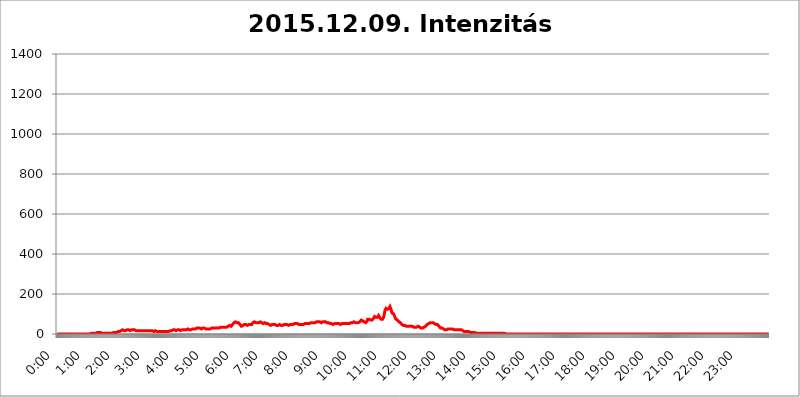
| Category | 2015.12.09. Intenzitás [W/m^2] |
|---|---|
| 0.0 | 0 |
| 0.0006944444444444445 | 0 |
| 0.001388888888888889 | 0 |
| 0.0020833333333333333 | 0 |
| 0.002777777777777778 | 0 |
| 0.003472222222222222 | 0 |
| 0.004166666666666667 | 0 |
| 0.004861111111111111 | 0 |
| 0.005555555555555556 | 0 |
| 0.0062499999999999995 | 0 |
| 0.006944444444444444 | 0 |
| 0.007638888888888889 | 0 |
| 0.008333333333333333 | 0 |
| 0.009027777777777779 | 0 |
| 0.009722222222222222 | 0 |
| 0.010416666666666666 | 0 |
| 0.011111111111111112 | 0 |
| 0.011805555555555555 | 0 |
| 0.012499999999999999 | 0 |
| 0.013194444444444444 | 0 |
| 0.013888888888888888 | 0 |
| 0.014583333333333332 | 0 |
| 0.015277777777777777 | 0 |
| 0.015972222222222224 | 0 |
| 0.016666666666666666 | 0 |
| 0.017361111111111112 | 0 |
| 0.018055555555555557 | 0 |
| 0.01875 | 0 |
| 0.019444444444444445 | 0 |
| 0.02013888888888889 | 0 |
| 0.020833333333333332 | 0 |
| 0.02152777777777778 | 0 |
| 0.022222222222222223 | 0 |
| 0.02291666666666667 | 0 |
| 0.02361111111111111 | 0 |
| 0.024305555555555556 | 0 |
| 0.024999999999999998 | 0 |
| 0.025694444444444447 | 0 |
| 0.02638888888888889 | 0 |
| 0.027083333333333334 | 0 |
| 0.027777777777777776 | 0 |
| 0.02847222222222222 | 0 |
| 0.029166666666666664 | 0 |
| 0.029861111111111113 | 0 |
| 0.030555555555555555 | 0 |
| 0.03125 | 0 |
| 0.03194444444444445 | 0 |
| 0.03263888888888889 | 0 |
| 0.03333333333333333 | 0 |
| 0.034027777777777775 | 0 |
| 0.034722222222222224 | 0 |
| 0.035416666666666666 | 0 |
| 0.036111111111111115 | 0 |
| 0.03680555555555556 | 0 |
| 0.0375 | 0 |
| 0.03819444444444444 | 0 |
| 0.03888888888888889 | 0 |
| 0.03958333333333333 | 0 |
| 0.04027777777777778 | 0 |
| 0.04097222222222222 | 0 |
| 0.041666666666666664 | 0 |
| 0.042361111111111106 | 0 |
| 0.04305555555555556 | 0 |
| 0.043750000000000004 | 0 |
| 0.044444444444444446 | 0 |
| 0.04513888888888889 | 0 |
| 0.04583333333333334 | 0 |
| 0.04652777777777778 | 0 |
| 0.04722222222222222 | 3.525 |
| 0.04791666666666666 | 3.525 |
| 0.04861111111111111 | 3.525 |
| 0.049305555555555554 | 3.525 |
| 0.049999999999999996 | 3.525 |
| 0.05069444444444445 | 3.525 |
| 0.051388888888888894 | 3.525 |
| 0.052083333333333336 | 3.525 |
| 0.05277777777777778 | 3.525 |
| 0.05347222222222222 | 3.525 |
| 0.05416666666666667 | 3.525 |
| 0.05486111111111111 | 7.887 |
| 0.05555555555555555 | 7.887 |
| 0.05625 | 7.887 |
| 0.05694444444444444 | 7.887 |
| 0.057638888888888885 | 7.887 |
| 0.05833333333333333 | 7.887 |
| 0.05902777777777778 | 7.887 |
| 0.059722222222222225 | 7.887 |
| 0.06041666666666667 | 7.887 |
| 0.061111111111111116 | 7.887 |
| 0.06180555555555556 | 3.525 |
| 0.0625 | 3.525 |
| 0.06319444444444444 | 3.525 |
| 0.06388888888888888 | 3.525 |
| 0.06458333333333334 | 3.525 |
| 0.06527777777777778 | 3.525 |
| 0.06597222222222222 | 3.525 |
| 0.06666666666666667 | 3.525 |
| 0.06736111111111111 | 3.525 |
| 0.06805555555555555 | 3.525 |
| 0.06874999999999999 | 3.525 |
| 0.06944444444444443 | 3.525 |
| 0.07013888888888889 | 3.525 |
| 0.07083333333333333 | 3.525 |
| 0.07152777777777779 | 3.525 |
| 0.07222222222222223 | 3.525 |
| 0.07291666666666667 | 3.525 |
| 0.07361111111111111 | 3.525 |
| 0.07430555555555556 | 3.525 |
| 0.075 | 3.525 |
| 0.07569444444444444 | 3.525 |
| 0.0763888888888889 | 3.525 |
| 0.07708333333333334 | 3.525 |
| 0.07777777777777778 | 3.525 |
| 0.07847222222222222 | 3.525 |
| 0.07916666666666666 | 7.887 |
| 0.0798611111111111 | 7.887 |
| 0.08055555555555556 | 7.887 |
| 0.08125 | 7.887 |
| 0.08194444444444444 | 7.887 |
| 0.08263888888888889 | 7.887 |
| 0.08333333333333333 | 7.887 |
| 0.08402777777777777 | 7.887 |
| 0.08472222222222221 | 12.257 |
| 0.08541666666666665 | 12.257 |
| 0.08611111111111112 | 12.257 |
| 0.08680555555555557 | 12.257 |
| 0.08750000000000001 | 12.257 |
| 0.08819444444444445 | 16.636 |
| 0.08888888888888889 | 16.636 |
| 0.08958333333333333 | 16.636 |
| 0.09027777777777778 | 21.024 |
| 0.09097222222222222 | 21.024 |
| 0.09166666666666667 | 21.024 |
| 0.09236111111111112 | 21.024 |
| 0.09305555555555556 | 16.636 |
| 0.09375 | 16.636 |
| 0.09444444444444444 | 16.636 |
| 0.09513888888888888 | 16.636 |
| 0.09583333333333333 | 16.636 |
| 0.09652777777777777 | 16.636 |
| 0.09722222222222222 | 21.024 |
| 0.09791666666666667 | 21.024 |
| 0.09861111111111111 | 21.024 |
| 0.09930555555555555 | 21.024 |
| 0.09999999999999999 | 21.024 |
| 0.10069444444444443 | 21.024 |
| 0.1013888888888889 | 16.636 |
| 0.10208333333333335 | 16.636 |
| 0.10277777777777779 | 21.024 |
| 0.10347222222222223 | 21.024 |
| 0.10416666666666667 | 21.024 |
| 0.10486111111111111 | 21.024 |
| 0.10555555555555556 | 21.024 |
| 0.10625 | 21.024 |
| 0.10694444444444444 | 21.024 |
| 0.1076388888888889 | 21.024 |
| 0.10833333333333334 | 21.024 |
| 0.10902777777777778 | 21.024 |
| 0.10972222222222222 | 16.636 |
| 0.1111111111111111 | 16.636 |
| 0.11180555555555556 | 16.636 |
| 0.11180555555555556 | 16.636 |
| 0.1125 | 16.636 |
| 0.11319444444444444 | 16.636 |
| 0.11388888888888889 | 16.636 |
| 0.11458333333333333 | 16.636 |
| 0.11527777777777777 | 16.636 |
| 0.11597222222222221 | 16.636 |
| 0.11666666666666665 | 16.636 |
| 0.1173611111111111 | 16.636 |
| 0.11805555555555557 | 16.636 |
| 0.11944444444444445 | 16.636 |
| 0.12013888888888889 | 16.636 |
| 0.12083333333333333 | 16.636 |
| 0.12152777777777778 | 16.636 |
| 0.12222222222222223 | 12.257 |
| 0.12291666666666667 | 16.636 |
| 0.12291666666666667 | 16.636 |
| 0.12361111111111112 | 16.636 |
| 0.12430555555555556 | 16.636 |
| 0.125 | 16.636 |
| 0.12569444444444444 | 16.636 |
| 0.12638888888888888 | 16.636 |
| 0.12708333333333333 | 16.636 |
| 0.16875 | 16.636 |
| 0.12847222222222224 | 16.636 |
| 0.12916666666666668 | 16.636 |
| 0.12986111111111112 | 16.636 |
| 0.13055555555555556 | 16.636 |
| 0.13125 | 16.636 |
| 0.13194444444444445 | 12.257 |
| 0.1326388888888889 | 12.257 |
| 0.13333333333333333 | 16.636 |
| 0.13402777777777777 | 12.257 |
| 0.13402777777777777 | 12.257 |
| 0.13472222222222222 | 12.257 |
| 0.13541666666666666 | 16.636 |
| 0.1361111111111111 | 16.636 |
| 0.13749999999999998 | 16.636 |
| 0.13819444444444443 | 16.636 |
| 0.1388888888888889 | 16.636 |
| 0.13958333333333334 | 12.257 |
| 0.14027777777777778 | 12.257 |
| 0.14097222222222222 | 12.257 |
| 0.14166666666666666 | 12.257 |
| 0.1423611111111111 | 12.257 |
| 0.14305555555555557 | 12.257 |
| 0.14375000000000002 | 12.257 |
| 0.14444444444444446 | 12.257 |
| 0.1451388888888889 | 12.257 |
| 0.1451388888888889 | 12.257 |
| 0.14652777777777778 | 12.257 |
| 0.14722222222222223 | 12.257 |
| 0.14791666666666667 | 12.257 |
| 0.1486111111111111 | 12.257 |
| 0.14930555555555555 | 12.257 |
| 0.15 | 12.257 |
| 0.15069444444444444 | 12.257 |
| 0.15138888888888888 | 12.257 |
| 0.15208333333333332 | 12.257 |
| 0.15277777777777776 | 12.257 |
| 0.15347222222222223 | 12.257 |
| 0.15416666666666667 | 12.257 |
| 0.15486111111111112 | 12.257 |
| 0.15555555555555556 | 12.257 |
| 0.15625 | 12.257 |
| 0.15694444444444444 | 12.257 |
| 0.15763888888888888 | 16.636 |
| 0.15833333333333333 | 16.636 |
| 0.15902777777777777 | 16.636 |
| 0.15972222222222224 | 16.636 |
| 0.16041666666666668 | 16.636 |
| 0.16111111111111112 | 16.636 |
| 0.16180555555555556 | 21.024 |
| 0.1625 | 21.024 |
| 0.16319444444444445 | 16.636 |
| 0.1638888888888889 | 21.024 |
| 0.16458333333333333 | 21.024 |
| 0.16527777777777777 | 21.024 |
| 0.16597222222222222 | 21.024 |
| 0.16666666666666666 | 16.636 |
| 0.1673611111111111 | 16.636 |
| 0.16805555555555554 | 16.636 |
| 0.16874999999999998 | 21.024 |
| 0.16944444444444443 | 21.024 |
| 0.17013888888888887 | 21.024 |
| 0.1708333333333333 | 21.024 |
| 0.17152777777777775 | 16.636 |
| 0.17222222222222225 | 16.636 |
| 0.1729166666666667 | 16.636 |
| 0.17361111111111113 | 16.636 |
| 0.17430555555555557 | 16.636 |
| 0.17500000000000002 | 21.024 |
| 0.17569444444444446 | 21.024 |
| 0.1763888888888889 | 21.024 |
| 0.17708333333333334 | 21.024 |
| 0.17777777777777778 | 21.024 |
| 0.17847222222222223 | 21.024 |
| 0.17916666666666667 | 21.024 |
| 0.1798611111111111 | 21.024 |
| 0.18055555555555555 | 21.024 |
| 0.18125 | 21.024 |
| 0.18194444444444444 | 21.024 |
| 0.1826388888888889 | 25.419 |
| 0.18333333333333335 | 25.419 |
| 0.1840277777777778 | 25.419 |
| 0.18472222222222223 | 25.419 |
| 0.18541666666666667 | 21.024 |
| 0.18611111111111112 | 21.024 |
| 0.18680555555555556 | 21.024 |
| 0.1875 | 21.024 |
| 0.18819444444444444 | 21.024 |
| 0.18888888888888888 | 21.024 |
| 0.18958333333333333 | 25.419 |
| 0.19027777777777777 | 25.419 |
| 0.1909722222222222 | 25.419 |
| 0.19166666666666665 | 25.419 |
| 0.19236111111111112 | 25.419 |
| 0.19305555555555554 | 25.419 |
| 0.19375 | 25.419 |
| 0.19444444444444445 | 25.419 |
| 0.1951388888888889 | 25.419 |
| 0.19583333333333333 | 29.823 |
| 0.19652777777777777 | 29.823 |
| 0.19722222222222222 | 29.823 |
| 0.19791666666666666 | 29.823 |
| 0.1986111111111111 | 29.823 |
| 0.19930555555555554 | 29.823 |
| 0.19999999999999998 | 29.823 |
| 0.20069444444444443 | 25.419 |
| 0.20138888888888887 | 25.419 |
| 0.2020833333333333 | 25.419 |
| 0.2027777777777778 | 25.419 |
| 0.2034722222222222 | 25.419 |
| 0.2041666666666667 | 29.823 |
| 0.20486111111111113 | 29.823 |
| 0.20555555555555557 | 29.823 |
| 0.20625000000000002 | 29.823 |
| 0.20694444444444446 | 25.419 |
| 0.2076388888888889 | 25.419 |
| 0.20833333333333334 | 25.419 |
| 0.20902777777777778 | 25.419 |
| 0.20972222222222223 | 25.419 |
| 0.21041666666666667 | 25.419 |
| 0.2111111111111111 | 25.419 |
| 0.21180555555555555 | 25.419 |
| 0.2125 | 25.419 |
| 0.21319444444444444 | 25.419 |
| 0.2138888888888889 | 25.419 |
| 0.21458333333333335 | 25.419 |
| 0.2152777777777778 | 25.419 |
| 0.21597222222222223 | 29.823 |
| 0.21666666666666667 | 29.823 |
| 0.21736111111111112 | 29.823 |
| 0.21805555555555556 | 29.823 |
| 0.21875 | 29.823 |
| 0.21944444444444444 | 29.823 |
| 0.22013888888888888 | 29.823 |
| 0.22083333333333333 | 29.823 |
| 0.22152777777777777 | 29.823 |
| 0.2222222222222222 | 29.823 |
| 0.22291666666666665 | 29.823 |
| 0.2236111111111111 | 29.823 |
| 0.22430555555555556 | 29.823 |
| 0.225 | 29.823 |
| 0.22569444444444445 | 29.823 |
| 0.2263888888888889 | 29.823 |
| 0.22708333333333333 | 29.823 |
| 0.22777777777777777 | 29.823 |
| 0.22847222222222222 | 29.823 |
| 0.22916666666666666 | 34.234 |
| 0.2298611111111111 | 34.234 |
| 0.23055555555555554 | 34.234 |
| 0.23124999999999998 | 34.234 |
| 0.23194444444444443 | 34.234 |
| 0.23263888888888887 | 34.234 |
| 0.2333333333333333 | 34.234 |
| 0.2340277777777778 | 34.234 |
| 0.2347222222222222 | 34.234 |
| 0.2354166666666667 | 34.234 |
| 0.23611111111111113 | 34.234 |
| 0.23680555555555557 | 34.234 |
| 0.23750000000000002 | 34.234 |
| 0.23819444444444446 | 38.653 |
| 0.2388888888888889 | 38.653 |
| 0.23958333333333334 | 38.653 |
| 0.24027777777777778 | 38.653 |
| 0.24097222222222223 | 38.653 |
| 0.24166666666666667 | 43.079 |
| 0.2423611111111111 | 43.079 |
| 0.24305555555555555 | 43.079 |
| 0.24375 | 38.653 |
| 0.24444444444444446 | 38.653 |
| 0.24513888888888888 | 43.079 |
| 0.24583333333333335 | 47.511 |
| 0.2465277777777778 | 47.511 |
| 0.24722222222222223 | 51.951 |
| 0.24791666666666667 | 56.398 |
| 0.24861111111111112 | 56.398 |
| 0.24930555555555556 | 56.398 |
| 0.25 | 60.85 |
| 0.25069444444444444 | 60.85 |
| 0.2513888888888889 | 56.398 |
| 0.2520833333333333 | 56.398 |
| 0.25277777777777777 | 56.398 |
| 0.2534722222222222 | 56.398 |
| 0.25416666666666665 | 56.398 |
| 0.2548611111111111 | 51.951 |
| 0.2555555555555556 | 51.951 |
| 0.25625000000000003 | 47.511 |
| 0.2569444444444445 | 43.079 |
| 0.2576388888888889 | 43.079 |
| 0.25833333333333336 | 38.653 |
| 0.2590277777777778 | 38.653 |
| 0.25972222222222224 | 38.653 |
| 0.2604166666666667 | 43.079 |
| 0.2611111111111111 | 43.079 |
| 0.26180555555555557 | 43.079 |
| 0.2625 | 47.511 |
| 0.26319444444444445 | 47.511 |
| 0.2638888888888889 | 47.511 |
| 0.26458333333333334 | 47.511 |
| 0.2652777777777778 | 47.511 |
| 0.2659722222222222 | 47.511 |
| 0.26666666666666666 | 43.079 |
| 0.2673611111111111 | 43.079 |
| 0.26805555555555555 | 43.079 |
| 0.26875 | 47.511 |
| 0.26944444444444443 | 47.511 |
| 0.2701388888888889 | 47.511 |
| 0.2708333333333333 | 47.511 |
| 0.27152777777777776 | 47.511 |
| 0.2722222222222222 | 47.511 |
| 0.27291666666666664 | 47.511 |
| 0.2736111111111111 | 51.951 |
| 0.2743055555555555 | 56.398 |
| 0.27499999999999997 | 60.85 |
| 0.27569444444444446 | 60.85 |
| 0.27638888888888885 | 60.85 |
| 0.27708333333333335 | 60.85 |
| 0.2777777777777778 | 60.85 |
| 0.27847222222222223 | 56.398 |
| 0.2791666666666667 | 56.398 |
| 0.2798611111111111 | 56.398 |
| 0.28055555555555556 | 56.398 |
| 0.28125 | 56.398 |
| 0.28194444444444444 | 56.398 |
| 0.2826388888888889 | 56.398 |
| 0.2833333333333333 | 60.85 |
| 0.28402777777777777 | 60.85 |
| 0.2847222222222222 | 60.85 |
| 0.28541666666666665 | 60.85 |
| 0.28611111111111115 | 56.398 |
| 0.28680555555555554 | 56.398 |
| 0.28750000000000003 | 56.398 |
| 0.2881944444444445 | 51.951 |
| 0.2888888888888889 | 51.951 |
| 0.28958333333333336 | 51.951 |
| 0.2902777777777778 | 56.398 |
| 0.29097222222222224 | 56.398 |
| 0.2916666666666667 | 56.398 |
| 0.2923611111111111 | 56.398 |
| 0.29305555555555557 | 51.951 |
| 0.29375 | 51.951 |
| 0.29444444444444445 | 51.951 |
| 0.2951388888888889 | 51.951 |
| 0.29583333333333334 | 51.951 |
| 0.2965277777777778 | 47.511 |
| 0.2972222222222222 | 47.511 |
| 0.29791666666666666 | 47.511 |
| 0.2986111111111111 | 47.511 |
| 0.29930555555555555 | 43.079 |
| 0.3 | 47.511 |
| 0.30069444444444443 | 47.511 |
| 0.3013888888888889 | 47.511 |
| 0.3020833333333333 | 47.511 |
| 0.30277777777777776 | 51.951 |
| 0.3034722222222222 | 47.511 |
| 0.30416666666666664 | 47.511 |
| 0.3048611111111111 | 47.511 |
| 0.3055555555555555 | 47.511 |
| 0.30624999999999997 | 43.079 |
| 0.3069444444444444 | 43.079 |
| 0.3076388888888889 | 43.079 |
| 0.30833333333333335 | 43.079 |
| 0.3090277777777778 | 43.079 |
| 0.30972222222222223 | 43.079 |
| 0.3104166666666667 | 47.511 |
| 0.3111111111111111 | 47.511 |
| 0.31180555555555556 | 47.511 |
| 0.3125 | 43.079 |
| 0.31319444444444444 | 43.079 |
| 0.3138888888888889 | 43.079 |
| 0.3145833333333333 | 43.079 |
| 0.31527777777777777 | 43.079 |
| 0.3159722222222222 | 43.079 |
| 0.31666666666666665 | 43.079 |
| 0.31736111111111115 | 47.511 |
| 0.31805555555555554 | 47.511 |
| 0.31875000000000003 | 47.511 |
| 0.3194444444444445 | 47.511 |
| 0.3201388888888889 | 47.511 |
| 0.32083333333333336 | 47.511 |
| 0.3215277777777778 | 47.511 |
| 0.32222222222222224 | 47.511 |
| 0.3229166666666667 | 43.079 |
| 0.3236111111111111 | 43.079 |
| 0.32430555555555557 | 43.079 |
| 0.325 | 47.511 |
| 0.32569444444444445 | 47.511 |
| 0.3263888888888889 | 47.511 |
| 0.32708333333333334 | 47.511 |
| 0.3277777777777778 | 47.511 |
| 0.3284722222222222 | 47.511 |
| 0.32916666666666666 | 47.511 |
| 0.3298611111111111 | 47.511 |
| 0.33055555555555555 | 47.511 |
| 0.33125 | 47.511 |
| 0.33194444444444443 | 47.511 |
| 0.3326388888888889 | 51.951 |
| 0.3333333333333333 | 51.951 |
| 0.3340277777777778 | 51.951 |
| 0.3347222222222222 | 51.951 |
| 0.3354166666666667 | 51.951 |
| 0.3361111111111111 | 51.951 |
| 0.3368055555555556 | 51.951 |
| 0.33749999999999997 | 51.951 |
| 0.33819444444444446 | 47.511 |
| 0.33888888888888885 | 47.511 |
| 0.33958333333333335 | 47.511 |
| 0.34027777777777773 | 47.511 |
| 0.34097222222222223 | 47.511 |
| 0.3416666666666666 | 47.511 |
| 0.3423611111111111 | 47.511 |
| 0.3430555555555555 | 47.511 |
| 0.34375 | 47.511 |
| 0.3444444444444445 | 47.511 |
| 0.3451388888888889 | 47.511 |
| 0.3458333333333334 | 51.951 |
| 0.34652777777777777 | 51.951 |
| 0.34722222222222227 | 51.951 |
| 0.34791666666666665 | 51.951 |
| 0.34861111111111115 | 51.951 |
| 0.34930555555555554 | 51.951 |
| 0.35000000000000003 | 51.951 |
| 0.3506944444444444 | 51.951 |
| 0.3513888888888889 | 51.951 |
| 0.3520833333333333 | 51.951 |
| 0.3527777777777778 | 51.951 |
| 0.3534722222222222 | 51.951 |
| 0.3541666666666667 | 56.398 |
| 0.3548611111111111 | 56.398 |
| 0.35555555555555557 | 56.398 |
| 0.35625 | 56.398 |
| 0.35694444444444445 | 56.398 |
| 0.3576388888888889 | 56.398 |
| 0.35833333333333334 | 56.398 |
| 0.3590277777777778 | 56.398 |
| 0.3597222222222222 | 56.398 |
| 0.36041666666666666 | 56.398 |
| 0.3611111111111111 | 56.398 |
| 0.36180555555555555 | 56.398 |
| 0.3625 | 60.85 |
| 0.36319444444444443 | 60.85 |
| 0.3638888888888889 | 60.85 |
| 0.3645833333333333 | 60.85 |
| 0.3652777777777778 | 60.85 |
| 0.3659722222222222 | 60.85 |
| 0.3666666666666667 | 60.85 |
| 0.3673611111111111 | 65.31 |
| 0.3680555555555556 | 60.85 |
| 0.36874999999999997 | 56.398 |
| 0.36944444444444446 | 56.398 |
| 0.37013888888888885 | 56.398 |
| 0.37083333333333335 | 56.398 |
| 0.37152777777777773 | 56.398 |
| 0.37222222222222223 | 60.85 |
| 0.3729166666666666 | 60.85 |
| 0.3736111111111111 | 60.85 |
| 0.3743055555555555 | 60.85 |
| 0.375 | 60.85 |
| 0.3756944444444445 | 60.85 |
| 0.3763888888888889 | 60.85 |
| 0.3770833333333334 | 60.85 |
| 0.37777777777777777 | 60.85 |
| 0.37847222222222227 | 56.398 |
| 0.37916666666666665 | 56.398 |
| 0.37986111111111115 | 56.398 |
| 0.38055555555555554 | 56.398 |
| 0.38125000000000003 | 56.398 |
| 0.3819444444444444 | 51.951 |
| 0.3826388888888889 | 51.951 |
| 0.3833333333333333 | 51.951 |
| 0.3840277777777778 | 51.951 |
| 0.3847222222222222 | 51.951 |
| 0.3854166666666667 | 51.951 |
| 0.3861111111111111 | 51.951 |
| 0.38680555555555557 | 47.511 |
| 0.3875 | 47.511 |
| 0.38819444444444445 | 51.951 |
| 0.3888888888888889 | 51.951 |
| 0.38958333333333334 | 51.951 |
| 0.3902777777777778 | 47.511 |
| 0.3909722222222222 | 51.951 |
| 0.39166666666666666 | 51.951 |
| 0.3923611111111111 | 47.511 |
| 0.39305555555555555 | 51.951 |
| 0.39375 | 47.511 |
| 0.39444444444444443 | 51.951 |
| 0.3951388888888889 | 51.951 |
| 0.3958333333333333 | 51.951 |
| 0.3965277777777778 | 51.951 |
| 0.3972222222222222 | 47.511 |
| 0.3979166666666667 | 51.951 |
| 0.3986111111111111 | 51.951 |
| 0.3993055555555556 | 51.951 |
| 0.39999999999999997 | 51.951 |
| 0.40069444444444446 | 51.951 |
| 0.40138888888888885 | 51.951 |
| 0.40208333333333335 | 51.951 |
| 0.40277777777777773 | 51.951 |
| 0.40347222222222223 | 51.951 |
| 0.4041666666666666 | 51.951 |
| 0.4048611111111111 | 51.951 |
| 0.4055555555555555 | 51.951 |
| 0.40625 | 51.951 |
| 0.4069444444444445 | 51.951 |
| 0.4076388888888889 | 51.951 |
| 0.4083333333333334 | 51.951 |
| 0.40902777777777777 | 51.951 |
| 0.40972222222222227 | 51.951 |
| 0.41041666666666665 | 51.951 |
| 0.41111111111111115 | 51.951 |
| 0.41180555555555554 | 56.398 |
| 0.41250000000000003 | 56.398 |
| 0.4131944444444444 | 56.398 |
| 0.4138888888888889 | 56.398 |
| 0.4145833333333333 | 60.85 |
| 0.4152777777777778 | 60.85 |
| 0.4159722222222222 | 60.85 |
| 0.4166666666666667 | 60.85 |
| 0.4173611111111111 | 60.85 |
| 0.41805555555555557 | 56.398 |
| 0.41875 | 56.398 |
| 0.41944444444444445 | 56.398 |
| 0.4201388888888889 | 56.398 |
| 0.42083333333333334 | 56.398 |
| 0.4215277777777778 | 56.398 |
| 0.4222222222222222 | 56.398 |
| 0.42291666666666666 | 60.85 |
| 0.4236111111111111 | 60.85 |
| 0.42430555555555555 | 60.85 |
| 0.425 | 60.85 |
| 0.42569444444444443 | 65.31 |
| 0.4263888888888889 | 69.775 |
| 0.4270833333333333 | 69.775 |
| 0.4277777777777778 | 69.775 |
| 0.4284722222222222 | 65.31 |
| 0.4291666666666667 | 65.31 |
| 0.4298611111111111 | 60.85 |
| 0.4305555555555556 | 60.85 |
| 0.43124999999999997 | 56.398 |
| 0.43194444444444446 | 56.398 |
| 0.43263888888888885 | 56.398 |
| 0.43333333333333335 | 56.398 |
| 0.43402777777777773 | 60.85 |
| 0.43472222222222223 | 65.31 |
| 0.4354166666666666 | 74.246 |
| 0.4361111111111111 | 78.722 |
| 0.4368055555555555 | 78.722 |
| 0.4375 | 74.246 |
| 0.4381944444444445 | 74.246 |
| 0.4388888888888889 | 74.246 |
| 0.4395833333333334 | 69.775 |
| 0.44027777777777777 | 69.775 |
| 0.44097222222222227 | 69.775 |
| 0.44166666666666665 | 69.775 |
| 0.44236111111111115 | 74.246 |
| 0.44305555555555554 | 74.246 |
| 0.44375000000000003 | 78.722 |
| 0.4444444444444444 | 83.205 |
| 0.4451388888888889 | 87.692 |
| 0.4458333333333333 | 92.184 |
| 0.4465277777777778 | 92.184 |
| 0.4472222222222222 | 83.205 |
| 0.4479166666666667 | 83.205 |
| 0.4486111111111111 | 83.205 |
| 0.44930555555555557 | 83.205 |
| 0.45 | 87.692 |
| 0.45069444444444445 | 92.184 |
| 0.4513888888888889 | 87.692 |
| 0.45208333333333334 | 83.205 |
| 0.4527777777777778 | 78.722 |
| 0.4534722222222222 | 78.722 |
| 0.45416666666666666 | 74.246 |
| 0.4548611111111111 | 69.775 |
| 0.45555555555555555 | 69.775 |
| 0.45625 | 74.246 |
| 0.45694444444444443 | 78.722 |
| 0.4576388888888889 | 83.205 |
| 0.4583333333333333 | 92.184 |
| 0.4590277777777778 | 105.69 |
| 0.4597222222222222 | 119.235 |
| 0.4604166666666667 | 123.758 |
| 0.4611111111111111 | 128.284 |
| 0.4618055555555556 | 132.814 |
| 0.46249999999999997 | 128.284 |
| 0.46319444444444446 | 123.758 |
| 0.46388888888888885 | 119.235 |
| 0.46458333333333335 | 123.758 |
| 0.46527777777777773 | 128.284 |
| 0.46597222222222223 | 132.814 |
| 0.4666666666666666 | 137.347 |
| 0.4673611111111111 | 132.814 |
| 0.4680555555555555 | 123.758 |
| 0.46875 | 114.716 |
| 0.4694444444444445 | 105.69 |
| 0.4701388888888889 | 105.69 |
| 0.4708333333333334 | 101.184 |
| 0.47152777777777777 | 101.184 |
| 0.47222222222222227 | 101.184 |
| 0.47291666666666665 | 92.184 |
| 0.47361111111111115 | 83.205 |
| 0.47430555555555554 | 78.722 |
| 0.47500000000000003 | 74.246 |
| 0.4756944444444444 | 74.246 |
| 0.4763888888888889 | 69.775 |
| 0.4770833333333333 | 69.775 |
| 0.4777777777777778 | 65.31 |
| 0.4784722222222222 | 65.31 |
| 0.4791666666666667 | 60.85 |
| 0.4798611111111111 | 56.398 |
| 0.48055555555555557 | 56.398 |
| 0.48125 | 56.398 |
| 0.48194444444444445 | 51.951 |
| 0.4826388888888889 | 51.951 |
| 0.48333333333333334 | 47.511 |
| 0.4840277777777778 | 47.511 |
| 0.4847222222222222 | 47.511 |
| 0.48541666666666666 | 43.079 |
| 0.4861111111111111 | 43.079 |
| 0.48680555555555555 | 43.079 |
| 0.4875 | 43.079 |
| 0.48819444444444443 | 38.653 |
| 0.4888888888888889 | 38.653 |
| 0.4895833333333333 | 38.653 |
| 0.4902777777777778 | 38.653 |
| 0.4909722222222222 | 38.653 |
| 0.4916666666666667 | 38.653 |
| 0.4923611111111111 | 38.653 |
| 0.4930555555555556 | 38.653 |
| 0.49374999999999997 | 38.653 |
| 0.49444444444444446 | 38.653 |
| 0.49513888888888885 | 38.653 |
| 0.49583333333333335 | 38.653 |
| 0.49652777777777773 | 34.234 |
| 0.49722222222222223 | 38.653 |
| 0.4979166666666666 | 38.653 |
| 0.4986111111111111 | 34.234 |
| 0.4993055555555555 | 34.234 |
| 0.5 | 34.234 |
| 0.5006944444444444 | 34.234 |
| 0.5013888888888889 | 34.234 |
| 0.5020833333333333 | 34.234 |
| 0.5027777777777778 | 34.234 |
| 0.5034722222222222 | 34.234 |
| 0.5041666666666667 | 34.234 |
| 0.5048611111111111 | 38.653 |
| 0.5055555555555555 | 38.653 |
| 0.50625 | 38.653 |
| 0.5069444444444444 | 38.653 |
| 0.5076388888888889 | 34.234 |
| 0.5083333333333333 | 34.234 |
| 0.5090277777777777 | 34.234 |
| 0.5097222222222222 | 34.234 |
| 0.5104166666666666 | 29.823 |
| 0.5111111111111112 | 29.823 |
| 0.5118055555555555 | 29.823 |
| 0.5125000000000001 | 29.823 |
| 0.5131944444444444 | 34.234 |
| 0.513888888888889 | 34.234 |
| 0.5145833333333333 | 34.234 |
| 0.5152777777777778 | 34.234 |
| 0.5159722222222222 | 38.653 |
| 0.5166666666666667 | 38.653 |
| 0.517361111111111 | 38.653 |
| 0.5180555555555556 | 43.079 |
| 0.5187499999999999 | 47.511 |
| 0.5194444444444445 | 47.511 |
| 0.5201388888888888 | 47.511 |
| 0.5208333333333334 | 51.951 |
| 0.5215277777777778 | 51.951 |
| 0.5222222222222223 | 51.951 |
| 0.5229166666666667 | 56.398 |
| 0.5236111111111111 | 56.398 |
| 0.5243055555555556 | 56.398 |
| 0.525 | 56.398 |
| 0.5256944444444445 | 56.398 |
| 0.5263888888888889 | 56.398 |
| 0.5270833333333333 | 56.398 |
| 0.5277777777777778 | 56.398 |
| 0.5284722222222222 | 51.951 |
| 0.5291666666666667 | 51.951 |
| 0.5298611111111111 | 51.951 |
| 0.5305555555555556 | 51.951 |
| 0.53125 | 47.511 |
| 0.5319444444444444 | 47.511 |
| 0.5326388888888889 | 47.511 |
| 0.5333333333333333 | 47.511 |
| 0.5340277777777778 | 43.079 |
| 0.5347222222222222 | 43.079 |
| 0.5354166666666667 | 38.653 |
| 0.5361111111111111 | 38.653 |
| 0.5368055555555555 | 34.234 |
| 0.5375 | 29.823 |
| 0.5381944444444444 | 29.823 |
| 0.5388888888888889 | 29.823 |
| 0.5395833333333333 | 29.823 |
| 0.5402777777777777 | 29.823 |
| 0.5409722222222222 | 29.823 |
| 0.5416666666666666 | 25.419 |
| 0.5423611111111112 | 25.419 |
| 0.5430555555555555 | 25.419 |
| 0.5437500000000001 | 21.024 |
| 0.5444444444444444 | 21.024 |
| 0.545138888888889 | 25.419 |
| 0.5458333333333333 | 21.024 |
| 0.5465277777777778 | 21.024 |
| 0.5472222222222222 | 25.419 |
| 0.5479166666666667 | 25.419 |
| 0.548611111111111 | 25.419 |
| 0.5493055555555556 | 25.419 |
| 0.5499999999999999 | 25.419 |
| 0.5506944444444445 | 25.419 |
| 0.5513888888888888 | 25.419 |
| 0.5520833333333334 | 25.419 |
| 0.5527777777777778 | 21.024 |
| 0.5534722222222223 | 25.419 |
| 0.5541666666666667 | 25.419 |
| 0.5548611111111111 | 25.419 |
| 0.5555555555555556 | 21.024 |
| 0.55625 | 21.024 |
| 0.5569444444444445 | 21.024 |
| 0.5576388888888889 | 21.024 |
| 0.5583333333333333 | 21.024 |
| 0.5590277777777778 | 21.024 |
| 0.5597222222222222 | 21.024 |
| 0.5604166666666667 | 21.024 |
| 0.5611111111111111 | 21.024 |
| 0.5618055555555556 | 21.024 |
| 0.5625 | 21.024 |
| 0.5631944444444444 | 21.024 |
| 0.5638888888888889 | 21.024 |
| 0.5645833333333333 | 21.024 |
| 0.5652777777777778 | 21.024 |
| 0.5659722222222222 | 21.024 |
| 0.5666666666666667 | 21.024 |
| 0.5673611111111111 | 16.636 |
| 0.5680555555555555 | 16.636 |
| 0.56875 | 16.636 |
| 0.5694444444444444 | 16.636 |
| 0.5701388888888889 | 16.636 |
| 0.5708333333333333 | 12.257 |
| 0.5715277777777777 | 12.257 |
| 0.5722222222222222 | 12.257 |
| 0.5729166666666666 | 12.257 |
| 0.5736111111111112 | 12.257 |
| 0.5743055555555555 | 12.257 |
| 0.5750000000000001 | 12.257 |
| 0.5756944444444444 | 12.257 |
| 0.576388888888889 | 12.257 |
| 0.5770833333333333 | 12.257 |
| 0.5777777777777778 | 7.887 |
| 0.5784722222222222 | 7.887 |
| 0.5791666666666667 | 7.887 |
| 0.579861111111111 | 7.887 |
| 0.5805555555555556 | 7.887 |
| 0.5812499999999999 | 7.887 |
| 0.5819444444444445 | 7.887 |
| 0.5826388888888888 | 7.887 |
| 0.5833333333333334 | 7.887 |
| 0.5840277777777778 | 7.887 |
| 0.5847222222222223 | 7.887 |
| 0.5854166666666667 | 7.887 |
| 0.5861111111111111 | 3.525 |
| 0.5868055555555556 | 3.525 |
| 0.5875 | 3.525 |
| 0.5881944444444445 | 3.525 |
| 0.5888888888888889 | 3.525 |
| 0.5895833333333333 | 3.525 |
| 0.5902777777777778 | 3.525 |
| 0.5909722222222222 | 3.525 |
| 0.5916666666666667 | 3.525 |
| 0.5923611111111111 | 3.525 |
| 0.5930555555555556 | 3.525 |
| 0.59375 | 3.525 |
| 0.5944444444444444 | 3.525 |
| 0.5951388888888889 | 3.525 |
| 0.5958333333333333 | 3.525 |
| 0.5965277777777778 | 3.525 |
| 0.5972222222222222 | 3.525 |
| 0.5979166666666667 | 3.525 |
| 0.5986111111111111 | 3.525 |
| 0.5993055555555555 | 3.525 |
| 0.6 | 3.525 |
| 0.6006944444444444 | 3.525 |
| 0.6013888888888889 | 3.525 |
| 0.6020833333333333 | 3.525 |
| 0.6027777777777777 | 3.525 |
| 0.6034722222222222 | 3.525 |
| 0.6041666666666666 | 3.525 |
| 0.6048611111111112 | 3.525 |
| 0.6055555555555555 | 3.525 |
| 0.6062500000000001 | 3.525 |
| 0.6069444444444444 | 3.525 |
| 0.607638888888889 | 3.525 |
| 0.6083333333333333 | 3.525 |
| 0.6090277777777778 | 3.525 |
| 0.6097222222222222 | 3.525 |
| 0.6104166666666667 | 3.525 |
| 0.611111111111111 | 3.525 |
| 0.6118055555555556 | 3.525 |
| 0.6124999999999999 | 3.525 |
| 0.6131944444444445 | 3.525 |
| 0.6138888888888888 | 3.525 |
| 0.6145833333333334 | 3.525 |
| 0.6152777777777778 | 3.525 |
| 0.6159722222222223 | 3.525 |
| 0.6166666666666667 | 3.525 |
| 0.6173611111111111 | 3.525 |
| 0.6180555555555556 | 3.525 |
| 0.61875 | 3.525 |
| 0.6194444444444445 | 3.525 |
| 0.6201388888888889 | 3.525 |
| 0.6208333333333333 | 3.525 |
| 0.6215277777777778 | 3.525 |
| 0.6222222222222222 | 3.525 |
| 0.6229166666666667 | 3.525 |
| 0.6236111111111111 | 3.525 |
| 0.6243055555555556 | 3.525 |
| 0.625 | 3.525 |
| 0.6256944444444444 | 3.525 |
| 0.6263888888888889 | 3.525 |
| 0.6270833333333333 | 3.525 |
| 0.6277777777777778 | 3.525 |
| 0.6284722222222222 | 3.525 |
| 0.6291666666666667 | 0 |
| 0.6298611111111111 | 3.525 |
| 0.6305555555555555 | 0 |
| 0.63125 | 0 |
| 0.6319444444444444 | 0 |
| 0.6326388888888889 | 0 |
| 0.6333333333333333 | 0 |
| 0.6340277777777777 | 0 |
| 0.6347222222222222 | 0 |
| 0.6354166666666666 | 0 |
| 0.6361111111111112 | 0 |
| 0.6368055555555555 | 0 |
| 0.6375000000000001 | 0 |
| 0.6381944444444444 | 0 |
| 0.638888888888889 | 0 |
| 0.6395833333333333 | 0 |
| 0.6402777777777778 | 0 |
| 0.6409722222222222 | 0 |
| 0.6416666666666667 | 0 |
| 0.642361111111111 | 0 |
| 0.6430555555555556 | 0 |
| 0.6437499999999999 | 0 |
| 0.6444444444444445 | 0 |
| 0.6451388888888888 | 0 |
| 0.6458333333333334 | 0 |
| 0.6465277777777778 | 0 |
| 0.6472222222222223 | 0 |
| 0.6479166666666667 | 0 |
| 0.6486111111111111 | 0 |
| 0.6493055555555556 | 0 |
| 0.65 | 0 |
| 0.6506944444444445 | 0 |
| 0.6513888888888889 | 0 |
| 0.6520833333333333 | 0 |
| 0.6527777777777778 | 0 |
| 0.6534722222222222 | 0 |
| 0.6541666666666667 | 0 |
| 0.6548611111111111 | 0 |
| 0.6555555555555556 | 0 |
| 0.65625 | 0 |
| 0.6569444444444444 | 0 |
| 0.6576388888888889 | 0 |
| 0.6583333333333333 | 0 |
| 0.6590277777777778 | 0 |
| 0.6597222222222222 | 0 |
| 0.6604166666666667 | 0 |
| 0.6611111111111111 | 0 |
| 0.6618055555555555 | 0 |
| 0.6625 | 0 |
| 0.6631944444444444 | 0 |
| 0.6638888888888889 | 0 |
| 0.6645833333333333 | 0 |
| 0.6652777777777777 | 0 |
| 0.6659722222222222 | 0 |
| 0.6666666666666666 | 0 |
| 0.6673611111111111 | 0 |
| 0.6680555555555556 | 0 |
| 0.6687500000000001 | 0 |
| 0.6694444444444444 | 0 |
| 0.6701388888888888 | 0 |
| 0.6708333333333334 | 0 |
| 0.6715277777777778 | 0 |
| 0.6722222222222222 | 0 |
| 0.6729166666666666 | 0 |
| 0.6736111111111112 | 0 |
| 0.6743055555555556 | 0 |
| 0.6749999999999999 | 0 |
| 0.6756944444444444 | 0 |
| 0.6763888888888889 | 0 |
| 0.6770833333333334 | 0 |
| 0.6777777777777777 | 0 |
| 0.6784722222222223 | 0 |
| 0.6791666666666667 | 0 |
| 0.6798611111111111 | 0 |
| 0.6805555555555555 | 0 |
| 0.68125 | 0 |
| 0.6819444444444445 | 0 |
| 0.6826388888888889 | 0 |
| 0.6833333333333332 | 0 |
| 0.6840277777777778 | 0 |
| 0.6847222222222222 | 0 |
| 0.6854166666666667 | 0 |
| 0.686111111111111 | 0 |
| 0.6868055555555556 | 0 |
| 0.6875 | 0 |
| 0.6881944444444444 | 0 |
| 0.688888888888889 | 0 |
| 0.6895833333333333 | 0 |
| 0.6902777777777778 | 0 |
| 0.6909722222222222 | 0 |
| 0.6916666666666668 | 0 |
| 0.6923611111111111 | 0 |
| 0.6930555555555555 | 0 |
| 0.69375 | 0 |
| 0.6944444444444445 | 0 |
| 0.6951388888888889 | 0 |
| 0.6958333333333333 | 0 |
| 0.6965277777777777 | 0 |
| 0.6972222222222223 | 0 |
| 0.6979166666666666 | 0 |
| 0.6986111111111111 | 0 |
| 0.6993055555555556 | 0 |
| 0.7000000000000001 | 0 |
| 0.7006944444444444 | 0 |
| 0.7013888888888888 | 0 |
| 0.7020833333333334 | 0 |
| 0.7027777777777778 | 0 |
| 0.7034722222222222 | 0 |
| 0.7041666666666666 | 0 |
| 0.7048611111111112 | 0 |
| 0.7055555555555556 | 0 |
| 0.7062499999999999 | 0 |
| 0.7069444444444444 | 0 |
| 0.7076388888888889 | 0 |
| 0.7083333333333334 | 0 |
| 0.7090277777777777 | 0 |
| 0.7097222222222223 | 0 |
| 0.7104166666666667 | 0 |
| 0.7111111111111111 | 0 |
| 0.7118055555555555 | 0 |
| 0.7125 | 0 |
| 0.7131944444444445 | 0 |
| 0.7138888888888889 | 0 |
| 0.7145833333333332 | 0 |
| 0.7152777777777778 | 0 |
| 0.7159722222222222 | 0 |
| 0.7166666666666667 | 0 |
| 0.717361111111111 | 0 |
| 0.7180555555555556 | 0 |
| 0.71875 | 0 |
| 0.7194444444444444 | 0 |
| 0.720138888888889 | 0 |
| 0.7208333333333333 | 0 |
| 0.7215277777777778 | 0 |
| 0.7222222222222222 | 0 |
| 0.7229166666666668 | 0 |
| 0.7236111111111111 | 0 |
| 0.7243055555555555 | 0 |
| 0.725 | 0 |
| 0.7256944444444445 | 0 |
| 0.7263888888888889 | 0 |
| 0.7270833333333333 | 0 |
| 0.7277777777777777 | 0 |
| 0.7284722222222223 | 0 |
| 0.7291666666666666 | 0 |
| 0.7298611111111111 | 0 |
| 0.7305555555555556 | 0 |
| 0.7312500000000001 | 0 |
| 0.7319444444444444 | 0 |
| 0.7326388888888888 | 0 |
| 0.7333333333333334 | 0 |
| 0.7340277777777778 | 0 |
| 0.7347222222222222 | 0 |
| 0.7354166666666666 | 0 |
| 0.7361111111111112 | 0 |
| 0.7368055555555556 | 0 |
| 0.7374999999999999 | 0 |
| 0.7381944444444444 | 0 |
| 0.7388888888888889 | 0 |
| 0.7395833333333334 | 0 |
| 0.7402777777777777 | 0 |
| 0.7409722222222223 | 0 |
| 0.7416666666666667 | 0 |
| 0.7423611111111111 | 0 |
| 0.7430555555555555 | 0 |
| 0.74375 | 0 |
| 0.7444444444444445 | 0 |
| 0.7451388888888889 | 0 |
| 0.7458333333333332 | 0 |
| 0.7465277777777778 | 0 |
| 0.7472222222222222 | 0 |
| 0.7479166666666667 | 0 |
| 0.748611111111111 | 0 |
| 0.7493055555555556 | 0 |
| 0.75 | 0 |
| 0.7506944444444444 | 0 |
| 0.751388888888889 | 0 |
| 0.7520833333333333 | 0 |
| 0.7527777777777778 | 0 |
| 0.7534722222222222 | 0 |
| 0.7541666666666668 | 0 |
| 0.7548611111111111 | 0 |
| 0.7555555555555555 | 0 |
| 0.75625 | 0 |
| 0.7569444444444445 | 0 |
| 0.7576388888888889 | 0 |
| 0.7583333333333333 | 0 |
| 0.7590277777777777 | 0 |
| 0.7597222222222223 | 0 |
| 0.7604166666666666 | 0 |
| 0.7611111111111111 | 0 |
| 0.7618055555555556 | 0 |
| 0.7625000000000001 | 0 |
| 0.7631944444444444 | 0 |
| 0.7638888888888888 | 0 |
| 0.7645833333333334 | 0 |
| 0.7652777777777778 | 0 |
| 0.7659722222222222 | 0 |
| 0.7666666666666666 | 0 |
| 0.7673611111111112 | 0 |
| 0.7680555555555556 | 0 |
| 0.7687499999999999 | 0 |
| 0.7694444444444444 | 0 |
| 0.7701388888888889 | 0 |
| 0.7708333333333334 | 0 |
| 0.7715277777777777 | 0 |
| 0.7722222222222223 | 0 |
| 0.7729166666666667 | 0 |
| 0.7736111111111111 | 0 |
| 0.7743055555555555 | 0 |
| 0.775 | 0 |
| 0.7756944444444445 | 0 |
| 0.7763888888888889 | 0 |
| 0.7770833333333332 | 0 |
| 0.7777777777777778 | 0 |
| 0.7784722222222222 | 0 |
| 0.7791666666666667 | 0 |
| 0.779861111111111 | 0 |
| 0.7805555555555556 | 0 |
| 0.78125 | 0 |
| 0.7819444444444444 | 0 |
| 0.782638888888889 | 0 |
| 0.7833333333333333 | 0 |
| 0.7840277777777778 | 0 |
| 0.7847222222222222 | 0 |
| 0.7854166666666668 | 0 |
| 0.7861111111111111 | 0 |
| 0.7868055555555555 | 0 |
| 0.7875 | 0 |
| 0.7881944444444445 | 0 |
| 0.7888888888888889 | 0 |
| 0.7895833333333333 | 0 |
| 0.7902777777777777 | 0 |
| 0.7909722222222223 | 0 |
| 0.7916666666666666 | 0 |
| 0.7923611111111111 | 0 |
| 0.7930555555555556 | 0 |
| 0.7937500000000001 | 0 |
| 0.7944444444444444 | 0 |
| 0.7951388888888888 | 0 |
| 0.7958333333333334 | 0 |
| 0.7965277777777778 | 0 |
| 0.7972222222222222 | 0 |
| 0.7979166666666666 | 0 |
| 0.7986111111111112 | 0 |
| 0.7993055555555556 | 0 |
| 0.7999999999999999 | 0 |
| 0.8006944444444444 | 0 |
| 0.8013888888888889 | 0 |
| 0.8020833333333334 | 0 |
| 0.8027777777777777 | 0 |
| 0.8034722222222223 | 0 |
| 0.8041666666666667 | 0 |
| 0.8048611111111111 | 0 |
| 0.8055555555555555 | 0 |
| 0.80625 | 0 |
| 0.8069444444444445 | 0 |
| 0.8076388888888889 | 0 |
| 0.8083333333333332 | 0 |
| 0.8090277777777778 | 0 |
| 0.8097222222222222 | 0 |
| 0.8104166666666667 | 0 |
| 0.811111111111111 | 0 |
| 0.8118055555555556 | 0 |
| 0.8125 | 0 |
| 0.8131944444444444 | 0 |
| 0.813888888888889 | 0 |
| 0.8145833333333333 | 0 |
| 0.8152777777777778 | 0 |
| 0.8159722222222222 | 0 |
| 0.8166666666666668 | 0 |
| 0.8173611111111111 | 0 |
| 0.8180555555555555 | 0 |
| 0.81875 | 0 |
| 0.8194444444444445 | 0 |
| 0.8201388888888889 | 0 |
| 0.8208333333333333 | 0 |
| 0.8215277777777777 | 0 |
| 0.8222222222222223 | 0 |
| 0.8229166666666666 | 0 |
| 0.8236111111111111 | 0 |
| 0.8243055555555556 | 0 |
| 0.8250000000000001 | 0 |
| 0.8256944444444444 | 0 |
| 0.8263888888888888 | 0 |
| 0.8270833333333334 | 0 |
| 0.8277777777777778 | 0 |
| 0.8284722222222222 | 0 |
| 0.8291666666666666 | 0 |
| 0.8298611111111112 | 0 |
| 0.8305555555555556 | 0 |
| 0.8312499999999999 | 0 |
| 0.8319444444444444 | 0 |
| 0.8326388888888889 | 0 |
| 0.8333333333333334 | 0 |
| 0.8340277777777777 | 0 |
| 0.8347222222222223 | 0 |
| 0.8354166666666667 | 0 |
| 0.8361111111111111 | 0 |
| 0.8368055555555555 | 0 |
| 0.8375 | 0 |
| 0.8381944444444445 | 0 |
| 0.8388888888888889 | 0 |
| 0.8395833333333332 | 0 |
| 0.8402777777777778 | 0 |
| 0.8409722222222222 | 0 |
| 0.8416666666666667 | 0 |
| 0.842361111111111 | 0 |
| 0.8430555555555556 | 0 |
| 0.84375 | 0 |
| 0.8444444444444444 | 0 |
| 0.845138888888889 | 0 |
| 0.8458333333333333 | 0 |
| 0.8465277777777778 | 0 |
| 0.8472222222222222 | 0 |
| 0.8479166666666668 | 0 |
| 0.8486111111111111 | 0 |
| 0.8493055555555555 | 0 |
| 0.85 | 0 |
| 0.8506944444444445 | 0 |
| 0.8513888888888889 | 0 |
| 0.8520833333333333 | 0 |
| 0.8527777777777777 | 0 |
| 0.8534722222222223 | 0 |
| 0.8541666666666666 | 0 |
| 0.8548611111111111 | 0 |
| 0.8555555555555556 | 0 |
| 0.8562500000000001 | 0 |
| 0.8569444444444444 | 0 |
| 0.8576388888888888 | 0 |
| 0.8583333333333334 | 0 |
| 0.8590277777777778 | 0 |
| 0.8597222222222222 | 0 |
| 0.8604166666666666 | 0 |
| 0.8611111111111112 | 0 |
| 0.8618055555555556 | 0 |
| 0.8624999999999999 | 0 |
| 0.8631944444444444 | 0 |
| 0.8638888888888889 | 0 |
| 0.8645833333333334 | 0 |
| 0.8652777777777777 | 0 |
| 0.8659722222222223 | 0 |
| 0.8666666666666667 | 0 |
| 0.8673611111111111 | 0 |
| 0.8680555555555555 | 0 |
| 0.86875 | 0 |
| 0.8694444444444445 | 0 |
| 0.8701388888888889 | 0 |
| 0.8708333333333332 | 0 |
| 0.8715277777777778 | 0 |
| 0.8722222222222222 | 0 |
| 0.8729166666666667 | 0 |
| 0.873611111111111 | 0 |
| 0.8743055555555556 | 0 |
| 0.875 | 0 |
| 0.8756944444444444 | 0 |
| 0.876388888888889 | 0 |
| 0.8770833333333333 | 0 |
| 0.8777777777777778 | 0 |
| 0.8784722222222222 | 0 |
| 0.8791666666666668 | 0 |
| 0.8798611111111111 | 0 |
| 0.8805555555555555 | 0 |
| 0.88125 | 0 |
| 0.8819444444444445 | 0 |
| 0.8826388888888889 | 0 |
| 0.8833333333333333 | 0 |
| 0.8840277777777777 | 0 |
| 0.8847222222222223 | 0 |
| 0.8854166666666666 | 0 |
| 0.8861111111111111 | 0 |
| 0.8868055555555556 | 0 |
| 0.8875000000000001 | 0 |
| 0.8881944444444444 | 0 |
| 0.8888888888888888 | 0 |
| 0.8895833333333334 | 0 |
| 0.8902777777777778 | 0 |
| 0.8909722222222222 | 0 |
| 0.8916666666666666 | 0 |
| 0.8923611111111112 | 0 |
| 0.8930555555555556 | 0 |
| 0.8937499999999999 | 0 |
| 0.8944444444444444 | 0 |
| 0.8951388888888889 | 0 |
| 0.8958333333333334 | 0 |
| 0.8965277777777777 | 0 |
| 0.8972222222222223 | 0 |
| 0.8979166666666667 | 0 |
| 0.8986111111111111 | 0 |
| 0.8993055555555555 | 0 |
| 0.9 | 0 |
| 0.9006944444444445 | 0 |
| 0.9013888888888889 | 0 |
| 0.9020833333333332 | 0 |
| 0.9027777777777778 | 0 |
| 0.9034722222222222 | 0 |
| 0.9041666666666667 | 0 |
| 0.904861111111111 | 0 |
| 0.9055555555555556 | 0 |
| 0.90625 | 0 |
| 0.9069444444444444 | 0 |
| 0.907638888888889 | 0 |
| 0.9083333333333333 | 0 |
| 0.9090277777777778 | 0 |
| 0.9097222222222222 | 0 |
| 0.9104166666666668 | 0 |
| 0.9111111111111111 | 0 |
| 0.9118055555555555 | 0 |
| 0.9125 | 0 |
| 0.9131944444444445 | 0 |
| 0.9138888888888889 | 0 |
| 0.9145833333333333 | 0 |
| 0.9152777777777777 | 0 |
| 0.9159722222222223 | 0 |
| 0.9166666666666666 | 0 |
| 0.9173611111111111 | 0 |
| 0.9180555555555556 | 0 |
| 0.9187500000000001 | 0 |
| 0.9194444444444444 | 0 |
| 0.9201388888888888 | 0 |
| 0.9208333333333334 | 0 |
| 0.9215277777777778 | 0 |
| 0.9222222222222222 | 0 |
| 0.9229166666666666 | 0 |
| 0.9236111111111112 | 0 |
| 0.9243055555555556 | 0 |
| 0.9249999999999999 | 0 |
| 0.9256944444444444 | 0 |
| 0.9263888888888889 | 0 |
| 0.9270833333333334 | 0 |
| 0.9277777777777777 | 0 |
| 0.9284722222222223 | 0 |
| 0.9291666666666667 | 0 |
| 0.9298611111111111 | 0 |
| 0.9305555555555555 | 0 |
| 0.93125 | 0 |
| 0.9319444444444445 | 0 |
| 0.9326388888888889 | 0 |
| 0.9333333333333332 | 0 |
| 0.9340277777777778 | 0 |
| 0.9347222222222222 | 0 |
| 0.9354166666666667 | 0 |
| 0.936111111111111 | 0 |
| 0.9368055555555556 | 0 |
| 0.9375 | 0 |
| 0.9381944444444444 | 0 |
| 0.938888888888889 | 0 |
| 0.9395833333333333 | 0 |
| 0.9402777777777778 | 0 |
| 0.9409722222222222 | 0 |
| 0.9416666666666668 | 0 |
| 0.9423611111111111 | 0 |
| 0.9430555555555555 | 0 |
| 0.94375 | 0 |
| 0.9444444444444445 | 0 |
| 0.9451388888888889 | 0 |
| 0.9458333333333333 | 0 |
| 0.9465277777777777 | 0 |
| 0.9472222222222223 | 0 |
| 0.9479166666666666 | 0 |
| 0.9486111111111111 | 0 |
| 0.9493055555555556 | 0 |
| 0.9500000000000001 | 0 |
| 0.9506944444444444 | 0 |
| 0.9513888888888888 | 0 |
| 0.9520833333333334 | 0 |
| 0.9527777777777778 | 0 |
| 0.9534722222222222 | 0 |
| 0.9541666666666666 | 0 |
| 0.9548611111111112 | 0 |
| 0.9555555555555556 | 0 |
| 0.9562499999999999 | 0 |
| 0.9569444444444444 | 0 |
| 0.9576388888888889 | 0 |
| 0.9583333333333334 | 0 |
| 0.9590277777777777 | 0 |
| 0.9597222222222223 | 0 |
| 0.9604166666666667 | 0 |
| 0.9611111111111111 | 0 |
| 0.9618055555555555 | 0 |
| 0.9625 | 0 |
| 0.9631944444444445 | 0 |
| 0.9638888888888889 | 0 |
| 0.9645833333333332 | 0 |
| 0.9652777777777778 | 0 |
| 0.9659722222222222 | 0 |
| 0.9666666666666667 | 0 |
| 0.967361111111111 | 0 |
| 0.9680555555555556 | 0 |
| 0.96875 | 0 |
| 0.9694444444444444 | 0 |
| 0.970138888888889 | 0 |
| 0.9708333333333333 | 0 |
| 0.9715277777777778 | 0 |
| 0.9722222222222222 | 0 |
| 0.9729166666666668 | 0 |
| 0.9736111111111111 | 0 |
| 0.9743055555555555 | 0 |
| 0.975 | 0 |
| 0.9756944444444445 | 0 |
| 0.9763888888888889 | 0 |
| 0.9770833333333333 | 0 |
| 0.9777777777777777 | 0 |
| 0.9784722222222223 | 0 |
| 0.9791666666666666 | 0 |
| 0.9798611111111111 | 0 |
| 0.9805555555555556 | 0 |
| 0.9812500000000001 | 0 |
| 0.9819444444444444 | 0 |
| 0.9826388888888888 | 0 |
| 0.9833333333333334 | 0 |
| 0.9840277777777778 | 0 |
| 0.9847222222222222 | 0 |
| 0.9854166666666666 | 0 |
| 0.9861111111111112 | 0 |
| 0.9868055555555556 | 0 |
| 0.9874999999999999 | 0 |
| 0.9881944444444444 | 0 |
| 0.9888888888888889 | 0 |
| 0.9895833333333334 | 0 |
| 0.9902777777777777 | 0 |
| 0.9909722222222223 | 0 |
| 0.9916666666666667 | 0 |
| 0.9923611111111111 | 0 |
| 0.9930555555555555 | 0 |
| 0.99375 | 0 |
| 0.9944444444444445 | 0 |
| 0.9951388888888889 | 0 |
| 0.9958333333333332 | 0 |
| 0.9965277777777778 | 0 |
| 0.9972222222222222 | 0 |
| 0.9979166666666667 | 0 |
| 0.998611111111111 | 0 |
| 0.9993055555555556 | 0 |